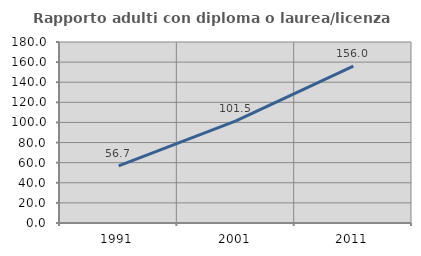
| Category | Rapporto adulti con diploma o laurea/licenza media  |
|---|---|
| 1991.0 | 56.725 |
| 2001.0 | 101.523 |
| 2011.0 | 156.021 |